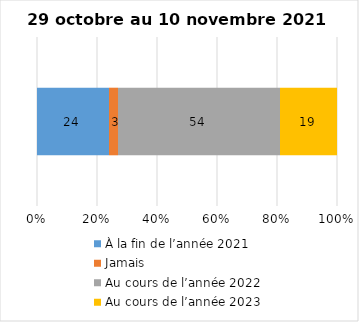
| Category | À la fin de l’année 2021 | Jamais | Au cours de l’année 2022 | Au cours de l’année 2023 |
|---|---|---|---|---|
| 0 | 24 | 3 | 54 | 19 |